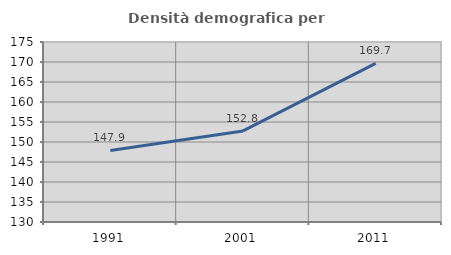
| Category | Densità demografica |
|---|---|
| 1991.0 | 147.881 |
| 2001.0 | 152.775 |
| 2011.0 | 169.672 |